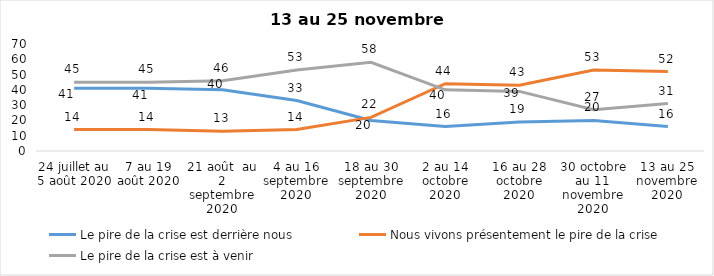
| Category | Le pire de la crise est derrière nous | Nous vivons présentement le pire de la crise | Le pire de la crise est à venir |
|---|---|---|---|
| 24 juillet au 5 août 2020 | 41 | 14 | 45 |
| 7 au 19 août 2020 | 41 | 14 | 45 |
| 21 août  au 2 septembre 2020 | 40 | 13 | 46 |
| 4 au 16 septembre 2020 | 33 | 14 | 53 |
| 18 au 30 septembre 2020 | 20 | 22 | 58 |
| 2 au 14 octobre 2020 | 16 | 44 | 40 |
| 16 au 28 octobre 2020 | 19 | 43 | 39 |
| 30 octobre au 11 novembre 2020 | 20 | 53 | 27 |
| 13 au 25 novembre 2020 | 16 | 52 | 31 |